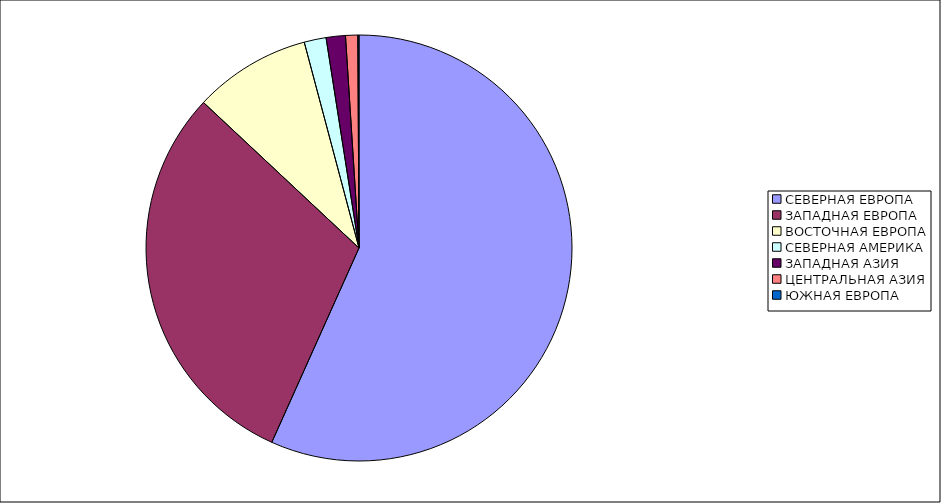
| Category | Оборот |
|---|---|
| СЕВЕРНАЯ ЕВРОПА | 56.672 |
| ЗАПАДНАЯ ЕВРОПА | 30.235 |
| ВОСТОЧНАЯ ЕВРОПА | 8.884 |
| СЕВЕРНАЯ АМЕРИКА | 1.661 |
| ЗАПАДНАЯ АЗИЯ | 1.461 |
| ЦЕНТРАЛЬНАЯ АЗИЯ | 0.925 |
| ЮЖНАЯ ЕВРОПА | 0.087 |